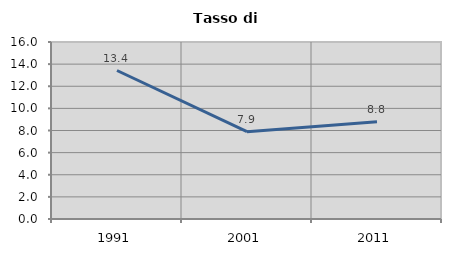
| Category | Tasso di disoccupazione   |
|---|---|
| 1991.0 | 13.423 |
| 2001.0 | 7.895 |
| 2011.0 | 8.8 |